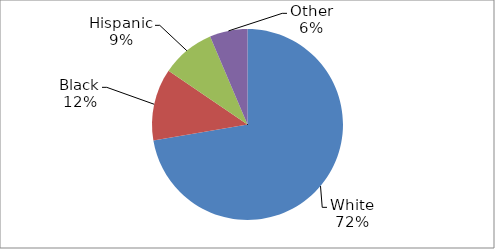
| Category | Series 0 |
|---|---|
| White | 0.723 |
| Black | 0.122 |
| Hispanic | 0.091 |
| Other | 0.064 |